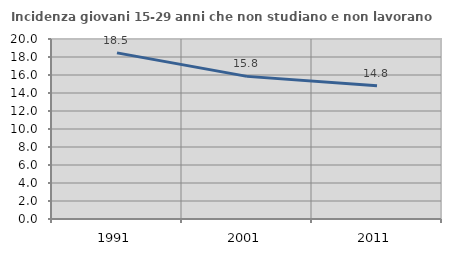
| Category | Incidenza giovani 15-29 anni che non studiano e non lavorano  |
|---|---|
| 1991.0 | 18.46 |
| 2001.0 | 15.847 |
| 2011.0 | 14.815 |